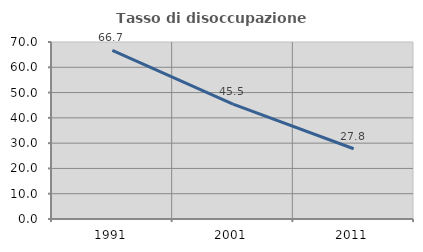
| Category | Tasso di disoccupazione giovanile  |
|---|---|
| 1991.0 | 66.667 |
| 2001.0 | 45.455 |
| 2011.0 | 27.778 |